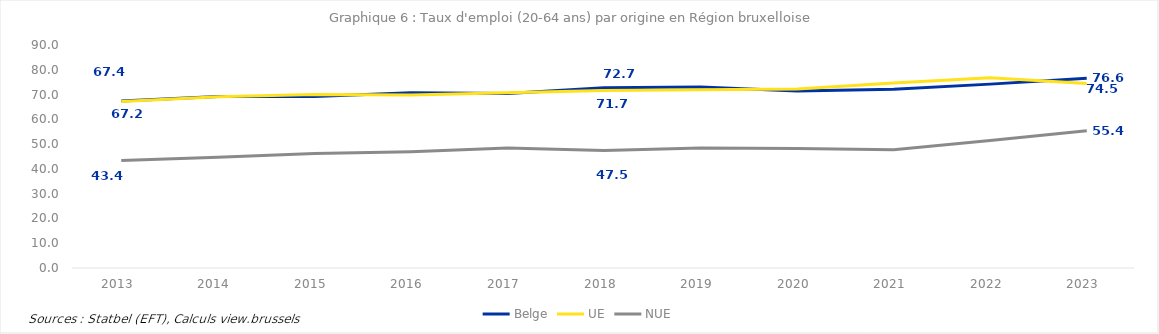
| Category | Belge | UE | NUE |
|---|---|---|---|
| 2013.0 | 67.351 | 67.227 | 43.365 |
| 2014.0 | 69.247 | 69.12 | 44.724 |
| 2015.0 | 69.209 | 70.011 | 46.169 |
| 2016.0 | 70.706 | 69.838 | 46.943 |
| 2017.0 | 70.472 | 70.776 | 48.384 |
| 2018.0 | 72.708 | 71.687 | 47.469 |
| 2019.0 | 73.097 | 71.927 | 48.447 |
| 2020.0 | 71.393 | 72.25 | 48.265 |
| 2021.0 | 72.108 | 74.693 | 47.734 |
| 2022.0 | 74.209 | 76.753 | 51.495 |
| 2023.0 | 76.58 | 74.489 | 55.374 |